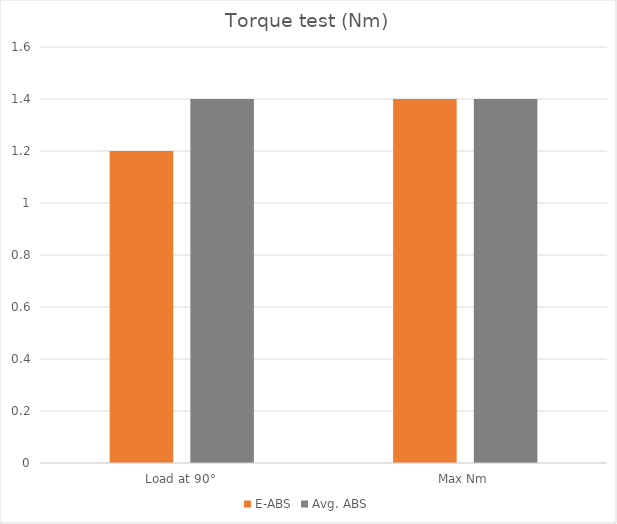
| Category | E-ABS | Avg. ABS |
|---|---|---|
| Load at 90° | 1.2 | 1.4 |
| Max Nm | 1.4 | 1.4 |